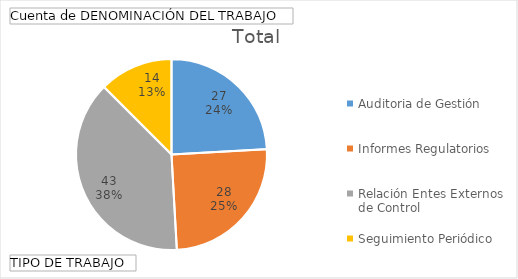
| Category | Total |
|---|---|
| Auditoria de Gestión | 27 |
| Informes Regulatorios | 28 |
| Relación Entes Externos de Control | 43 |
| Seguimiento Periódico | 14 |